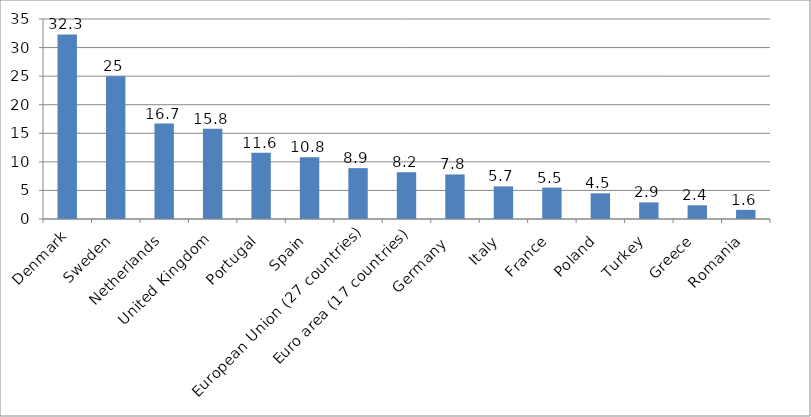
| Category | 2011 |
|---|---|
| Denmark | 32.3 |
| Sweden | 25 |
| Netherlands | 16.7 |
| United Kingdom | 15.8 |
| Portugal | 11.6 |
| Spain | 10.8 |
| European Union (27 countries) | 8.9 |
| Euro area (17 countries) | 8.2 |
| Germany  | 7.8 |
| Italy | 5.7 |
| France | 5.5 |
| Poland | 4.5 |
| Turkey | 2.9 |
| Greece | 2.4 |
| Romania | 1.6 |